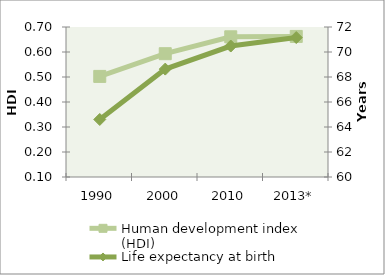
| Category | Human development index (HDI) |
|---|---|
| 1990 | 0.502 |
| 2000 | 0.593 |
| 2010 | 0.661 |
| 2013* | 0.662 |